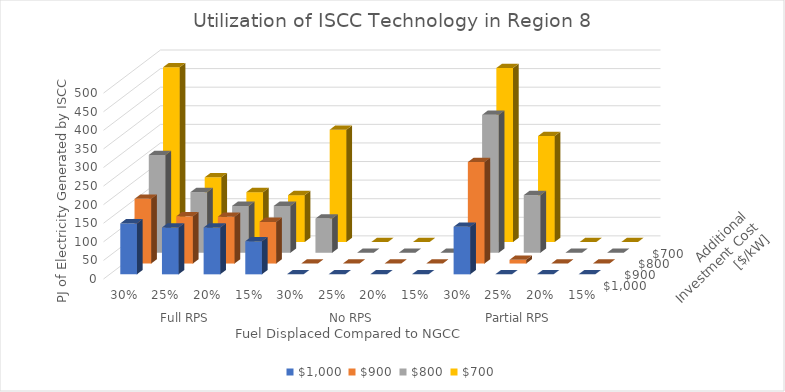
| Category | $1,000  | $900  | $800  | $700  |
|---|---|---|---|---|
| 0 | 137 | 174 | 263 | 470 |
| 1 | 126 | 127 | 163 | 174 |
| 2 | 126 | 126 | 126 | 134 |
| 3 | 89 | 112 | 126 | 126 |
| 4 | 0 | 0 | 92 | 302 |
| 5 | 0 | 0 | 0 | 0 |
| 6 | 0 | 0 | 0 | 0 |
| 7 | 0 | 0 | 0 | 0 |
| 8 | 128 | 273 | 371 | 468 |
| 9 | 0 | 10 | 155 | 285 |
| 10 | 0 | 0 | 0 | 0 |
| 11 | 0 | 0 | 0 | 0 |